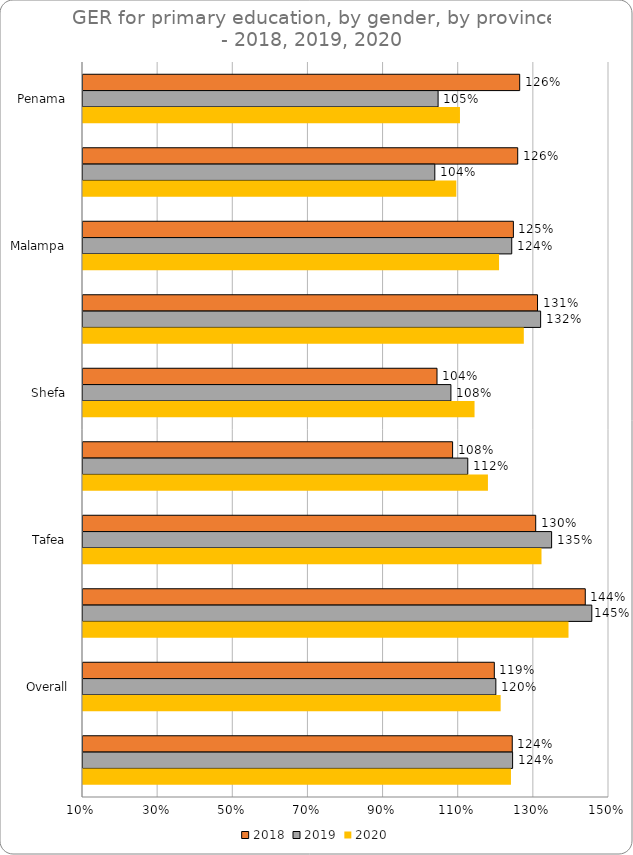
| Category | 2018 | 2019 | 2020 |
|---|---|---|---|
| Penama  | 1.262 | 1.045 | 1.103 |
|  | 1.257 | 1.036 | 1.094 |
| Malampa  | 1.246 | 1.241 | 1.207 |
|  | 1.31 | 1.318 | 1.273 |
| Shefa  | 1.042 | 1.079 | 1.142 |
|  | 1.084 | 1.124 | 1.178 |
| Tafea  | 1.305 | 1.347 | 1.32 |
|  | 1.437 | 1.454 | 1.392 |
| Overall | 1.195 | 1.199 | 1.212 |